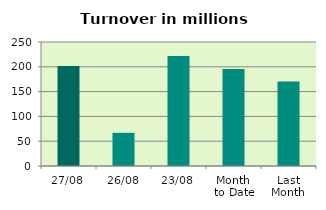
| Category | Series 0 |
|---|---|
| 27/08 | 201.622 |
| 26/08 | 66.873 |
| 23/08 | 221.673 |
| Month 
to Date | 195.409 |
| Last
Month | 170.387 |